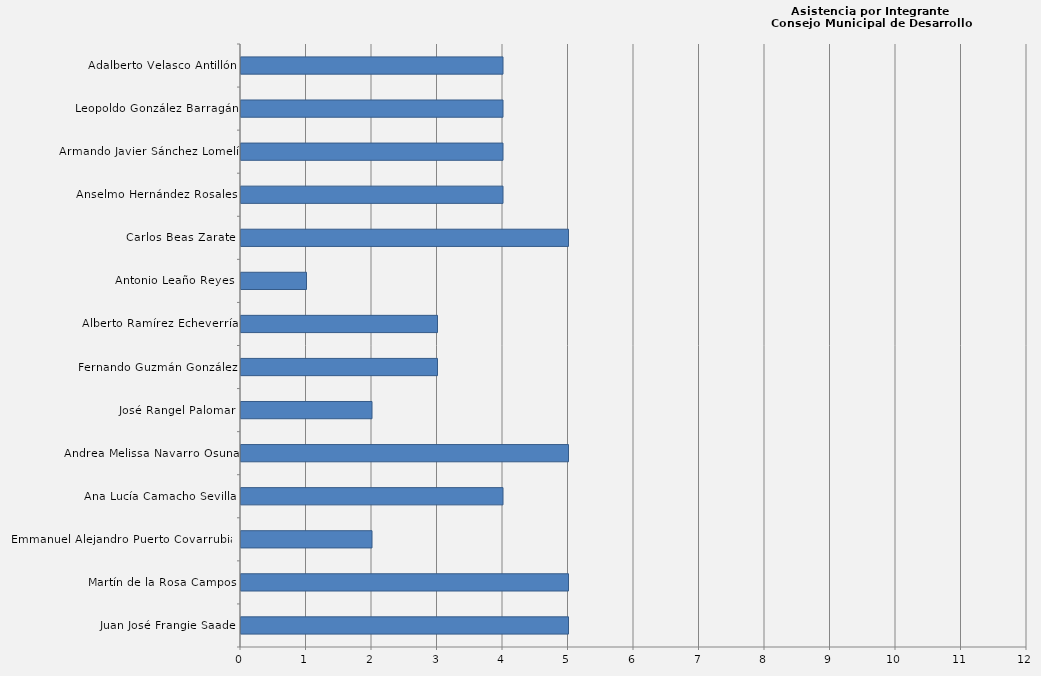
| Category | Series 0 |
|---|---|
| Juan José Frangie Saade | 5 |
| Martín de la Rosa Campos | 5 |
| Emmanuel Alejandro Puerto Covarrubias | 2 |
| Ana Lucía Camacho Sevilla | 4 |
| Andrea Melissa Navarro Osuna | 5 |
| José Rangel Palomar | 2 |
| Fernando Guzmán González | 3 |
| Alberto Ramírez Echeverría | 3 |
| Antonio Leaño Reyes | 1 |
| Carlos Beas Zarate | 5 |
| Anselmo Hernández Rosales | 4 |
| Armando Javier Sánchez Lomelí | 4 |
| Leopoldo González Barragán | 4 |
| Adalberto Velasco Antillón | 4 |